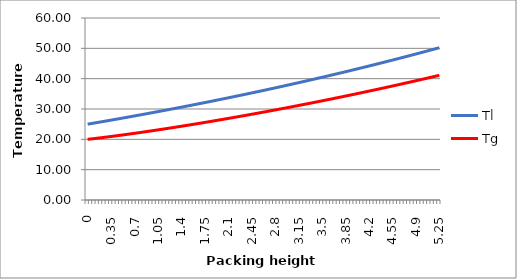
| Category | Tl | Tg |
|---|---|---|
| 0.0 | 25 | 20 |
| 0.05 | 25.188 | 20.128 |
| 0.1 | 25.378 | 20.258 |
| 0.15 | 25.568 | 20.39 |
| 0.2 | 25.759 | 20.525 |
| 0.25 | 25.951 | 20.662 |
| 0.3 | 26.143 | 20.802 |
| 0.35 | 26.337 | 20.943 |
| 0.4 | 26.531 | 21.087 |
| 0.45 | 26.727 | 21.233 |
| 0.5 | 26.923 | 21.38 |
| 0.55 | 27.12 | 21.53 |
| 0.6 | 27.318 | 21.681 |
| 0.65 | 27.517 | 21.834 |
| 0.7 | 27.717 | 21.989 |
| 0.75 | 27.917 | 22.146 |
| 0.8 | 28.119 | 22.304 |
| 0.85 | 28.321 | 22.464 |
| 0.9 | 28.525 | 22.625 |
| 0.95 | 28.729 | 22.788 |
| 1.0 | 28.934 | 22.952 |
| 1.05 | 29.14 | 23.118 |
| 1.1 | 29.347 | 23.285 |
| 1.15 | 29.555 | 23.454 |
| 1.2 | 29.764 | 23.624 |
| 1.25 | 29.974 | 23.795 |
| 1.3 | 30.185 | 23.968 |
| 1.35 | 30.396 | 24.142 |
| 1.4 | 30.609 | 24.317 |
| 1.45 | 30.823 | 24.494 |
| 1.5 | 31.037 | 24.672 |
| 1.55 | 31.253 | 24.851 |
| 1.6 | 31.469 | 25.031 |
| 1.65 | 31.687 | 25.213 |
| 1.7 | 31.905 | 25.395 |
| 1.75 | 32.124 | 25.579 |
| 1.8 | 32.345 | 25.764 |
| 1.85 | 32.566 | 25.95 |
| 1.9 | 32.789 | 26.137 |
| 1.95 | 33.012 | 26.326 |
| 2.0 | 33.236 | 26.515 |
| 2.05 | 33.462 | 26.706 |
| 2.1 | 33.688 | 26.897 |
| 2.15 | 33.916 | 27.09 |
| 2.2 | 34.144 | 27.284 |
| 2.25 | 34.374 | 27.479 |
| 2.3 | 34.604 | 27.675 |
| 2.35 | 34.836 | 27.872 |
| 2.4 | 35.068 | 28.07 |
| 2.45 | 35.302 | 28.269 |
| 2.5 | 35.537 | 28.469 |
| 2.55 | 35.772 | 28.671 |
| 2.6 | 36.009 | 28.873 |
| 2.65 | 36.247 | 29.076 |
| 2.7 | 36.486 | 29.281 |
| 2.75 | 36.726 | 29.486 |
| 2.8 | 36.967 | 29.692 |
| 2.85 | 37.209 | 29.9 |
| 2.9 | 37.452 | 30.108 |
| 2.95 | 37.697 | 30.318 |
| 3.0 | 37.942 | 30.529 |
| 3.05 | 38.188 | 30.74 |
| 3.1 | 38.436 | 30.953 |
| 3.15 | 38.685 | 31.166 |
| 3.2 | 38.935 | 31.381 |
| 3.25 | 39.186 | 31.597 |
| 3.3 | 39.438 | 31.814 |
| 3.35 | 39.691 | 32.032 |
| 3.4 | 39.945 | 32.25 |
| 3.45 | 40.201 | 32.47 |
| 3.5 | 40.457 | 32.691 |
| 3.55 | 40.715 | 32.913 |
| 3.6 | 40.974 | 33.136 |
| 3.65 | 41.234 | 33.36 |
| 3.7 | 41.496 | 33.586 |
| 3.75 | 41.758 | 33.812 |
| 3.8 | 42.022 | 34.039 |
| 3.85 | 42.287 | 34.267 |
| 3.9 | 42.553 | 34.497 |
| 3.95 | 42.82 | 34.727 |
| 4.0 | 43.088 | 34.959 |
| 4.05 | 43.358 | 35.191 |
| 4.1 | 43.629 | 35.425 |
| 4.15 | 43.901 | 35.659 |
| 4.2 | 44.174 | 35.895 |
| 4.25 | 44.448 | 36.132 |
| 4.3 | 44.724 | 36.37 |
| 4.35 | 45.001 | 36.609 |
| 4.4 | 45.279 | 36.849 |
| 4.45 | 45.559 | 37.09 |
| 4.5 | 45.839 | 37.333 |
| 4.55 | 46.121 | 37.576 |
| 4.6 | 46.404 | 37.821 |
| 4.65 | 46.689 | 38.066 |
| 4.7 | 46.975 | 38.313 |
| 4.75 | 47.262 | 38.561 |
| 4.8 | 47.55 | 38.81 |
| 4.85 | 47.84 | 39.06 |
| 4.9 | 48.131 | 39.312 |
| 4.95 | 48.423 | 39.564 |
| 5.0 | 48.716 | 39.818 |
| 5.05 | 49.011 | 40.072 |
| 5.1 | 49.307 | 40.328 |
| 5.15 | 49.605 | 40.585 |
| 5.2 | 49.904 | 40.844 |
| 5.25 | 50.204 | 41.103 |